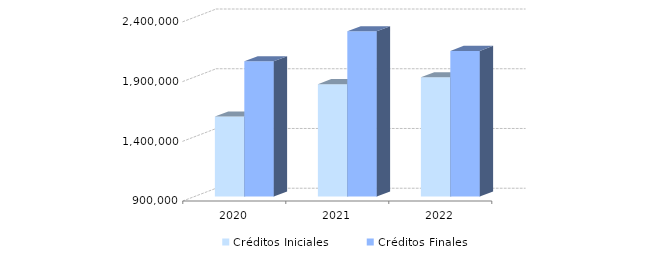
| Category | Créditos Iniciales | Créditos Finales |
|---|---|---|
| 2020.0 | 1569828.12 | 2032170.41 |
| 2021.0 | 1840359.08 | 2283189.71 |
| 2022.0 | 1897893.61 | 2119170.78 |